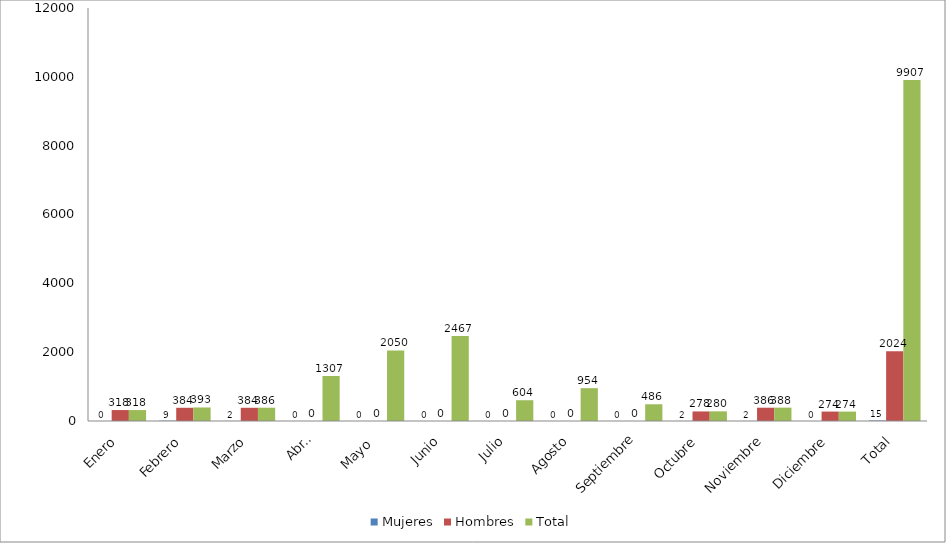
| Category | Mujeres | Hombres | Total |
|---|---|---|---|
| Enero | 0 | 318 | 318 |
| Febrero | 9 | 384 | 393 |
| Marzo | 2 | 384 | 386 |
| Abril | 0 | 0 | 1307 |
| Mayo  | 0 | 0 | 2050 |
| Junio | 0 | 0 | 2467 |
| Julio | 0 | 0 | 604 |
| Agosto | 0 | 0 | 954 |
| Septiembre | 0 | 0 | 486 |
| Octubre | 2 | 278 | 280 |
| Noviembre | 2 | 386 | 388 |
| Diciembre | 0 | 274 | 274 |
| Total | 15 | 2024 | 9907 |